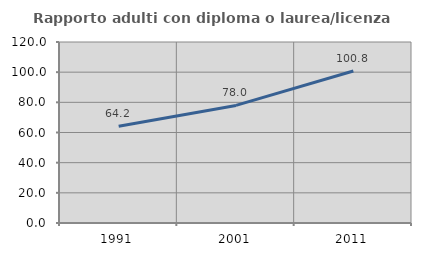
| Category | Rapporto adulti con diploma o laurea/licenza media  |
|---|---|
| 1991.0 | 64.179 |
| 2001.0 | 77.966 |
| 2011.0 | 100.763 |